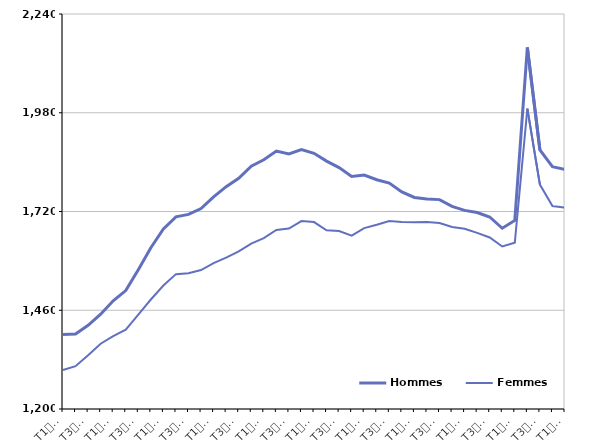
| Category | Hommes  | Femmes  |
|---|---|---|
| T1
2011 | 1395.9 | 1302.6 |
| T2
2011 | 1397.6 | 1312.8 |
| T3
2011 | 1420.4 | 1341.3 |
| T4
2011 | 1449.7 | 1371.8 |
| T1
2012 | 1484.8 | 1391.6 |
| T2
2012 | 1511.8 | 1409 |
| T3
2012 | 1566.9 | 1448.3 |
| T4
2012 | 1624.7 | 1488.3 |
| T1
2013 | 1674.2 | 1525.1 |
| T2
2013 | 1705.8 | 1555.1 |
| T3
2013 | 1712.4 | 1557.7 |
| T4
2013 | 1727.9 | 1565.9 |
| T1
2014 | 1758.7 | 1584.3 |
| T2
2014 | 1785.3 | 1598.4 |
| T3
2014 | 1807.3 | 1614.8 |
| T4
2014 | 1839.3 | 1635.5 |
| T1
2015 | 1856.3 | 1649.7 |
| T2
2015 | 1879.2 | 1671.3 |
| T3
2015 | 1871.6 | 1675.1 |
| T4
2015 | 1882.9 | 1694.8 |
| T1
2016 | 1873.3 | 1692.2 |
| T2
2016 | 1852.7 | 1670.7 |
| T3
2016 | 1835.5 | 1668.5 |
| T4
2016 | 1812 | 1656.3 |
| T1
2017 | 1816.1 | 1676.2 |
| T2
2017 | 1803.7 | 1685 |
| T3
2017 | 1794.7 | 1694.9 |
| T4
2017 | 1771.7 | 1692.3 |
| T1
2018 | 1756.9 | 1691.8 |
| T2
2018 | 1752.8 | 1692.6 |
| T3
2018 | 1751.3 | 1689.8 |
| T4
2018 | 1733.6 | 1679 |
| T1
2019 | 1722.9 | 1674.7 |
| T2
2019 | 1717.3 | 1663.8 |
| T3
2019 | 1705.6 | 1651.7 |
| T4
2019 | 1675.9 | 1628 |
| T1
2020 | 1696.4 | 1637.7 |
| T2
2020 | 2151.9 | 1990.8 |
| T3
2020 | 1882.4 | 1790.8 |
| T4
2020 | 1838.2 | 1734.5 |
| T1
2021 | 1830.6 | 1730 |